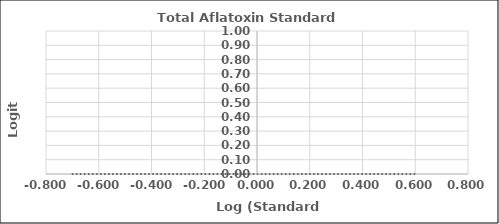
| Category | Series 0 |
|---|---|
| -0.6989700043360187 | 0 |
| -0.3010299956639812 | 0 |
| 0.0 | 0 |
| 0.3010299956639812 | 0 |
| 0.6020599913279624 | 0 |